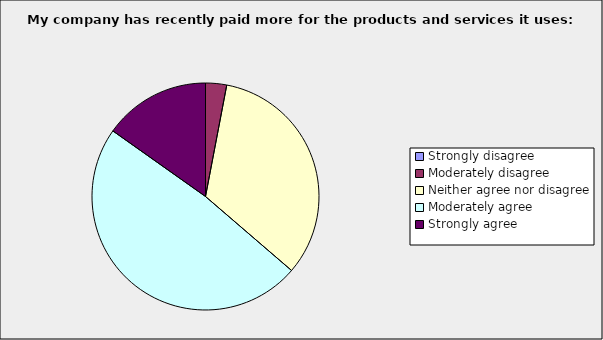
| Category | Series 0 |
|---|---|
| Strongly disagree | 0 |
| Moderately disagree | 0.03 |
| Neither agree nor disagree | 0.333 |
| Moderately agree | 0.485 |
| Strongly agree | 0.152 |